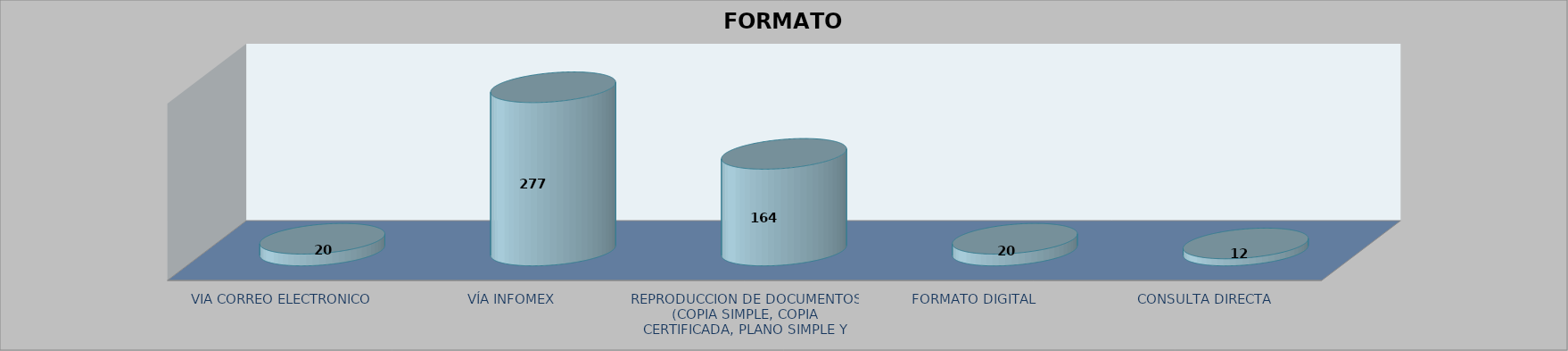
| Category |        FORMATO SOLICITADO | Series 1 | Series 2 |
|---|---|---|---|
| VIA CORREO ELECTRONICO |  |  | 20 |
| VÍA INFOMEX |  |  | 277 |
| REPRODUCCION DE DOCUMENTOS (COPIA SIMPLE, COPIA CERTIFICADA, PLANO SIMPLE Y PLANO CERTIFICADO) |  |  | 164 |
| FORMATO DIGITAL |  |  | 20 |
| CONSULTA DIRECTA |  |  | 12 |